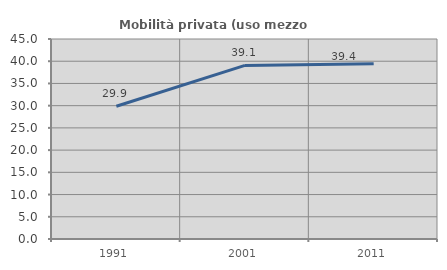
| Category | Mobilità privata (uso mezzo privato) |
|---|---|
| 1991.0 | 29.87 |
| 2001.0 | 39.062 |
| 2011.0 | 39.437 |